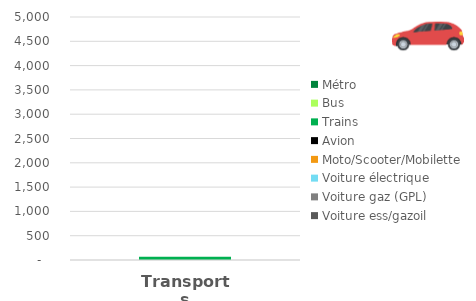
| Category | Voiture ess/gazoil | Voiture gaz (GPL) | Voiture électrique | Moto/Scooter/Mobilette | Avion | Trains | Bus | Métro |
|---|---|---|---|---|---|---|---|---|
| 0 | 0 | 0 | 0 | 0 | 0 | 67.2 | 0 | 0 |